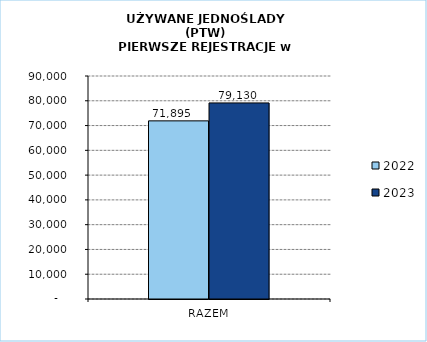
| Category | 2022 | 2023 |
|---|---|---|
| RAZEM | 71895 | 79130 |